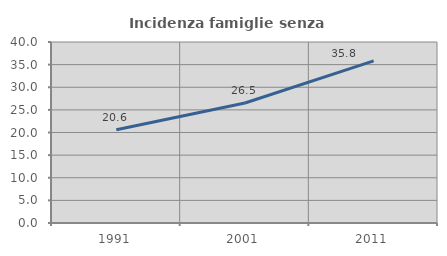
| Category | Incidenza famiglie senza nuclei |
|---|---|
| 1991.0 | 20.593 |
| 2001.0 | 26.52 |
| 2011.0 | 35.829 |